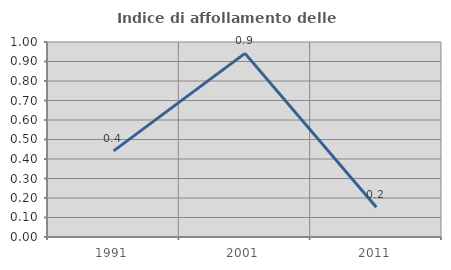
| Category | Indice di affollamento delle abitazioni  |
|---|---|
| 1991.0 | 0.442 |
| 2001.0 | 0.942 |
| 2011.0 | 0.153 |